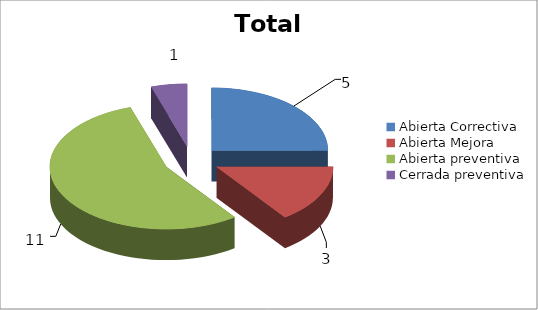
| Category | Total |
|---|---|
| 0 | 5 |
| 1 | 3 |
| 2 | 11 |
| 3 | 1 |